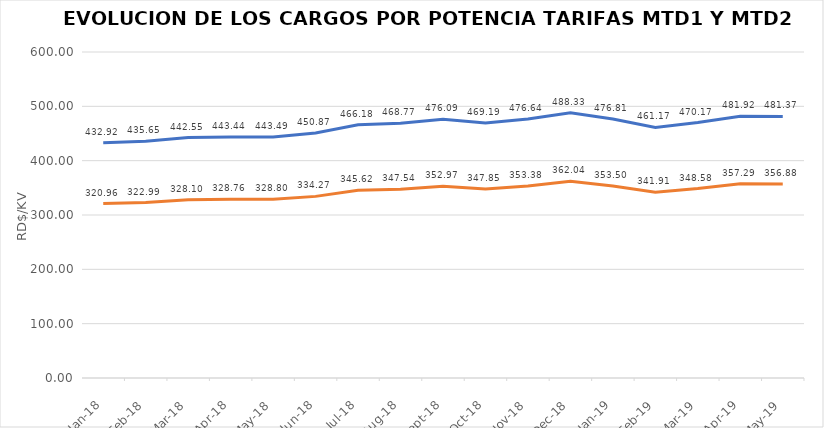
| Category | Series 0 | Series 1 |
|---|---|---|
| 2018-01-01 | 432.921 | 320.963 |
| 2018-02-01 | 435.65 | 322.99 |
| 2018-03-01 | 442.548 | 328.1 |
| 2018-04-01 | 443.441 | 328.763 |
| 2018-05-01 | 443.49 | 328.8 |
| 2018-06-01 | 450.875 | 334.273 |
| 2018-07-01 | 466.183 | 345.623 |
| 2018-08-01 | 468.773 | 347.543 |
| 2018-09-01 | 476.093 | 352.97 |
| 2018-10-01 | 469.192 | 347.854 |
| 2018-11-01 | 476.64 | 353.38 |
| 2018-12-01 | 488.33 | 362.04 |
| 2019-01-01 | 476.807 | 353.5 |
| 2019-02-01 | 461.172 | 341.908 |
| 2019-03-01 | 470.171 | 348.58 |
| 2019-04-01 | 481.92 | 357.29 |
| 2019-05-01 | 481.37 | 356.88 |